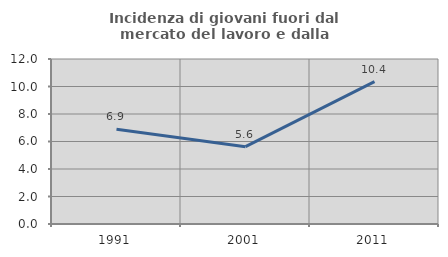
| Category | Incidenza di giovani fuori dal mercato del lavoro e dalla formazione  |
|---|---|
| 1991.0 | 6.897 |
| 2001.0 | 5.625 |
| 2011.0 | 10.35 |